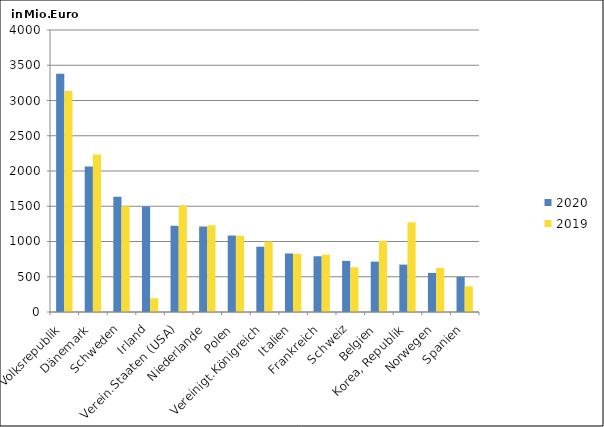
| Category | 2020 | 2019 |
|---|---|---|
| China, Volksrepublik | 3378.721 | 3136.296 |
| Dänemark | 2065.253 | 2232.605 |
| Schweden | 1633.567 | 1501.685 |
| Irland | 1496.678 | 194.477 |
| Verein.Staaten (USA) | 1222.917 | 1510.058 |
| Niederlande | 1212.393 | 1229.498 |
| Polen | 1084.94 | 1081.297 |
| Vereinigt.Königreich | 926.386 | 1000.609 |
| Italien | 830.285 | 826.039 |
| Frankreich | 790.228 | 814.33 |
| Schweiz | 725.149 | 634.223 |
| Belgien | 714.286 | 1009.868 |
| Korea, Republik | 672.403 | 1272.6 |
| Norwegen | 554.329 | 624.641 |
| Spanien | 499.128 | 364.574 |